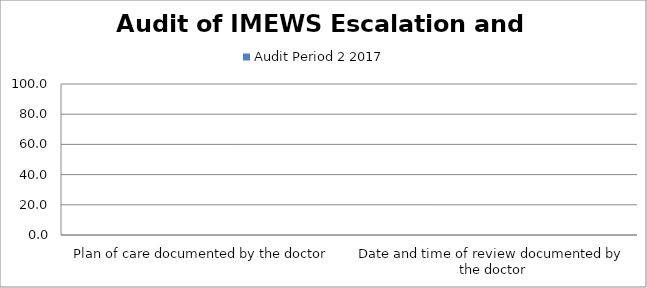
| Category | Audit Period 2 2017 |
|---|---|
| Plan of care documented by the doctor | 0 |
| Date and time of review documented by the doctor | 0 |